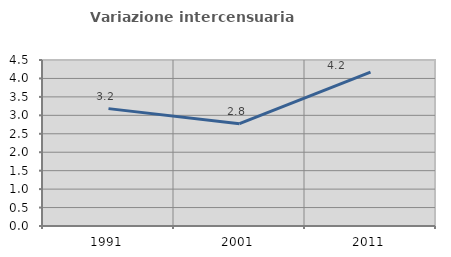
| Category | Variazione intercensuaria annua |
|---|---|
| 1991.0 | 3.182 |
| 2001.0 | 2.774 |
| 2011.0 | 4.169 |